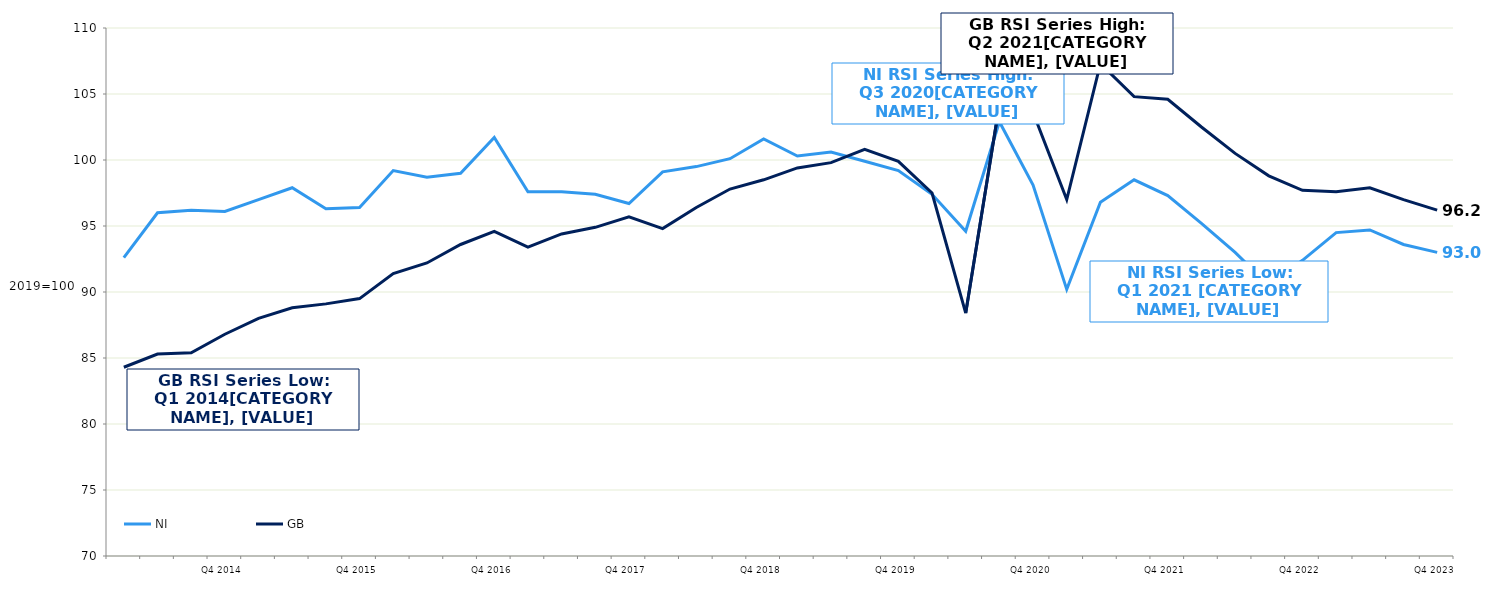
| Category | NI | GB  |
|---|---|---|
|  | 92.6 | 84.3 |
|  | 96 | 85.3 |
|  | 96.2 | 85.4 |
| Q4 2014 | 96.1 | 86.8 |
|  | 97 | 88 |
|  | 97.9 | 88.8 |
|  | 96.3 | 89.1 |
| Q4 2015 | 96.4 | 89.5 |
|  | 99.2 | 91.4 |
|  | 98.7 | 92.2 |
|  | 99 | 93.6 |
| Q4 2016 | 101.7 | 94.6 |
|  | 97.6 | 93.4 |
|  | 97.6 | 94.4 |
|  | 97.4 | 94.9 |
| Q4 2017 | 96.7 | 95.7 |
|  | 99.1 | 94.8 |
|  | 99.5 | 96.4 |
|  | 100.1 | 97.8 |
| Q4 2018 | 101.6 | 98.5 |
|  | 100.3 | 99.4 |
|  | 100.6 | 99.8 |
|  | 99.9 | 100.8 |
| Q4 2019 | 99.2 | 99.9 |
|  | 97.4 | 97.5 |
|  | 94.6 | 88.4 |
|  | 102.9 | 104.2 |
| Q4 2020 | 98.1 | 103.6 |
|  | 90.2 | 97 |
|  | 96.8 | 107.3 |
|  | 98.5 | 104.8 |
| Q4 2021 | 97.3 | 104.6 |
|  | 95.2 | 102.5 |
|  | 93 | 100.5 |
|  | 90.5 | 98.8 |
| Q4 2022 | 92.4 | 97.7 |
|  | 94.5 | 97.6 |
|  | 94.7 | 97.9 |
|  | 93.6 | 97 |
| Q4 2023 | 93 | 96.2 |